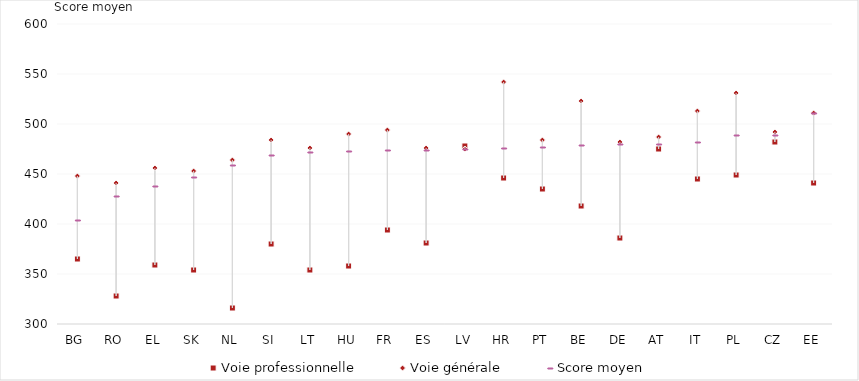
| Category | Voie professionnelle | Voie générale | Score moyen |
|---|---|---|---|
| BG | 365 | 448 | 404 |
| RO | 328 | 441 | 428 |
| EL | 359 | 456 | 438 |
| SK | 354 | 453 | 447 |
| NL | 316 | 464 | 459 |
| SI | 380 | 484 | 469 |
| LT | 354 | 476 | 472 |
| HU | 358 | 490 | 473 |
| FR | 394 | 494 | 474 |
| ES | 381 | 476 | 474 |
| LV | 478 | 475 | 475 |
| HR | 446 | 542 | 476 |
| PT | 435 | 484 | 477 |
| BE | 418 | 523 | 479 |
| DE | 386 | 482 | 480 |
| AT | 475 | 487 | 480 |
| IT | 445 | 513 | 482 |
| PL | 449 | 531 | 489 |
| CZ | 482 | 492 | 489 |
| EE | 441 | 511 | 511 |